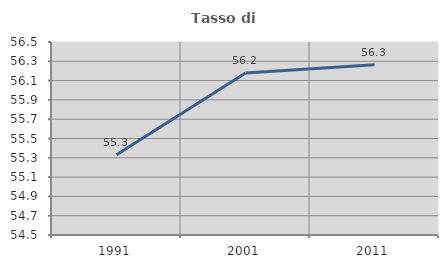
| Category | Tasso di occupazione   |
|---|---|
| 1991.0 | 55.332 |
| 2001.0 | 56.179 |
| 2011.0 | 56.265 |